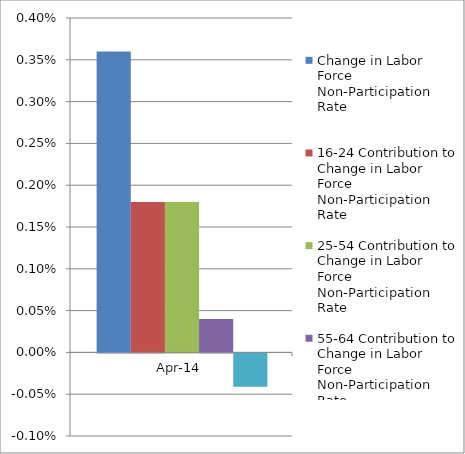
| Category | Change in Labor Force Non-Participation Rate | 16-24 Contribution to Change in Labor Force Non-Participation Rate | 25-54 Contribution to Change in Labor Force Non-Participation Rate | 55-64 Contribution to Change in Labor Force Non-Participation Rate | 65 and Over Contribution to Change in Labor Force Non-Participation Rate |
|---|---|---|---|---|---|
| 2014-04-01 | 0.004 | 0.002 | 0.002 | 0 | 0 |